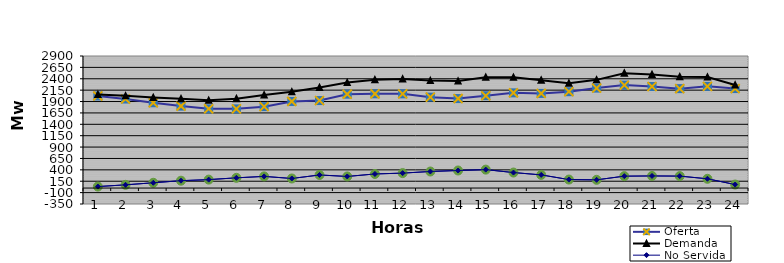
| Category | Oferta | No Servida | Demanda |
|---|---|---|---|
| 1.0 | 2021.98 | 32.886 | 2054.866 |
| 2.0 | 1955.44 | 70.668 | 2026.108 |
| 3.0 | 1872.73 | 116.284 | 1989.014 |
| 4.0 | 1799.44 | 162.071 | 1961.511 |
| 5.0 | 1740.46 | 185.321 | 1925.781 |
| 6.0 | 1739.11 | 224.673 | 1963.783 |
| 7.0 | 1787.92 | 256.206 | 2044.126 |
| 8.0 | 1902.24 | 210.495 | 2112.735 |
| 9.0 | 1921.48 | 287.305 | 2208.785 |
| 10.0 | 2061.8 | 254.614 | 2316.414 |
| 11.0 | 2069.06 | 309.716 | 2378.776 |
| 12.0 | 2068.55 | 328.324 | 2396.874 |
| 13.0 | 1996.84 | 363.766 | 2360.606 |
| 14.0 | 1965.45 | 385.596 | 2351.046 |
| 15.0 | 2027.43 | 405.001 | 2432.431 |
| 16.0 | 2090.62 | 340.376 | 2430.996 |
| 17.0 | 2078.68 | 289.362 | 2368.042 |
| 18.0 | 2116.35 | 186.468 | 2302.818 |
| 19.0 | 2195.36 | 180.801 | 2376.161 |
| 20.0 | 2260.93 | 261.654 | 2522.584 |
| 21.0 | 2229.56 | 266.095 | 2495.655 |
| 22.0 | 2183.07 | 262.499 | 2445.569 |
| 23.0 | 2232.99 | 203.59 | 2436.58 |
| 24.0 | 2184.35 | 77.25 | 2261.6 |